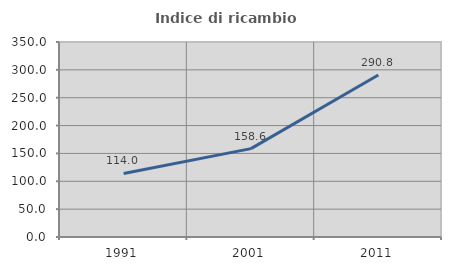
| Category | Indice di ricambio occupazionale  |
|---|---|
| 1991.0 | 113.989 |
| 2001.0 | 158.617 |
| 2011.0 | 290.781 |